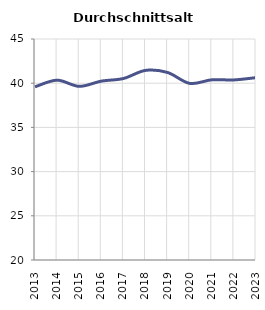
| Category | Durchschnittsalter |
|---|---|
| 2013.0 | 39.589 |
| 2014.0 | 40.342 |
| 2015.0 | 39.644 |
| 2016.0 | 40.234 |
| 2017.0 | 40.531 |
| 2018.0 | 41.448 |
| 2019.0 | 41.211 |
| 2020.0 | 39.98 |
| 2021.0 | 40.383 |
| 2022.0 | 40.37 |
| 2023.0 | 40.627 |